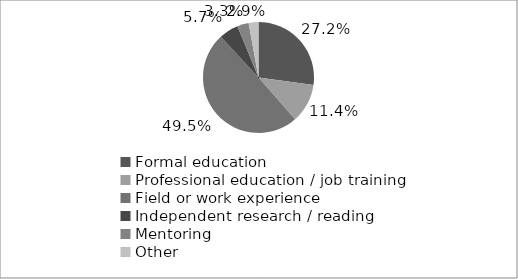
| Category | Series 0 |
|---|---|
| Formal education | 0.271 |
| Professional education / job training | 0.114 |
| Field or work experience | 0.495 |
| Independent research / reading | 0.057 |
| Mentoring | 0.033 |
| Other  | 0.029 |